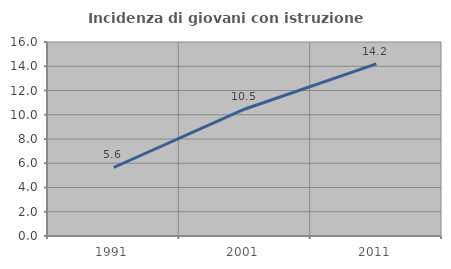
| Category | Incidenza di giovani con istruzione universitaria |
|---|---|
| 1991.0 | 5.65 |
| 2001.0 | 10.476 |
| 2011.0 | 14.194 |